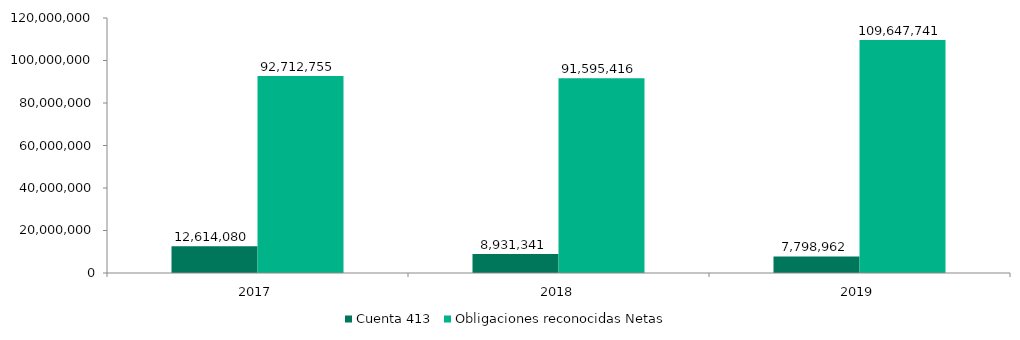
| Category | Cuenta 413 | Obligaciones reconocidas Netas |
|---|---|---|
| 2017.0 | 12614080.34 | 92712755.26 |
| 2018.0 | 8931340.73 | 91595415.74 |
| 2019.0 | 7798962.41 | 109647741.08 |